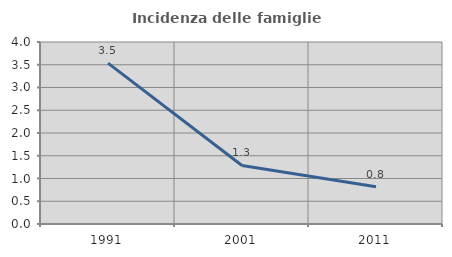
| Category | Incidenza delle famiglie numerose |
|---|---|
| 1991.0 | 3.535 |
| 2001.0 | 1.286 |
| 2011.0 | 0.819 |